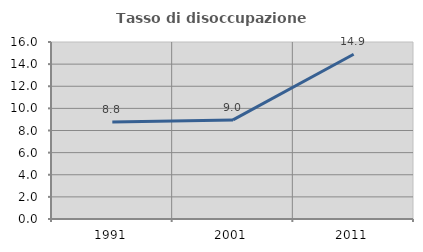
| Category | Tasso di disoccupazione giovanile  |
|---|---|
| 1991.0 | 8.763 |
| 2001.0 | 8.955 |
| 2011.0 | 14.894 |